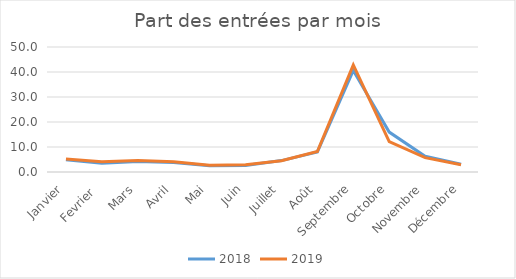
| Category | 2018 | 2019 |
|---|---|---|
| Janvier | 4.861 | 5.245 |
| Fevrier  | 3.464 | 4.103 |
| Mars | 4.178 | 4.584 |
| Avril | 3.835 | 4.137 |
| Mai | 2.522 | 2.701 |
| Juin | 2.644 | 2.878 |
| Juillet | 4.557 | 4.531 |
| Août | 8.02 | 8.212 |
| Septembre | 40.595 | 42.856 |
| Octobre | 15.96 | 12.135 |
| Novembre | 6.267 | 5.738 |
| Décembre | 3.097 | 2.88 |